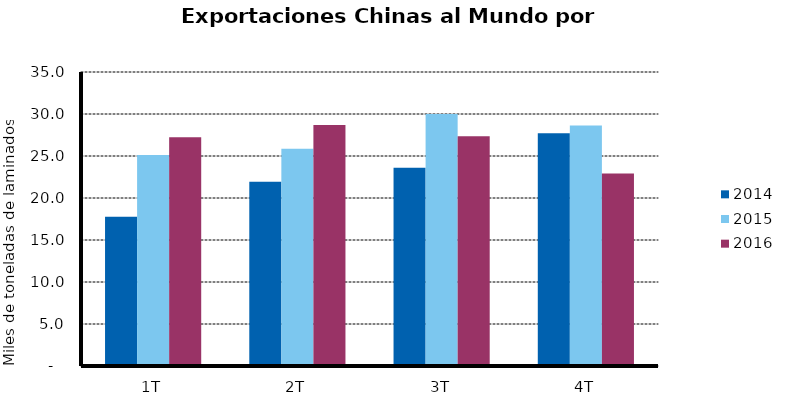
| Category | 2014 | 2015 | 2016 |
|---|---|---|---|
| 1T | 17.756 | 25.128 | 27.233 |
| 2T | 21.922 | 25.869 | 28.682 |
| 3T | 23.605 | 30 | 27.357 |
| 4T | 27.714 | 28.622 | 22.913 |